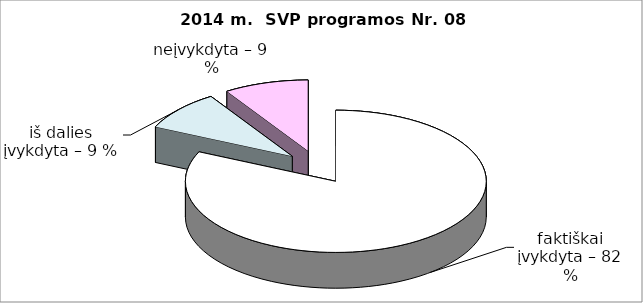
| Category | Series 0 |
|---|---|
|  | 9 |
| iš dalies įvykdyta – | 1 |
| neįvykdyta – | 1 |